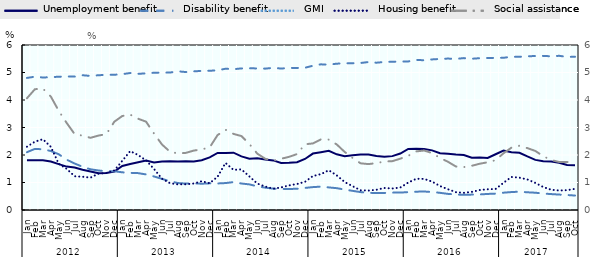
| Category | Unemployment benefit | GMI | Housing benefit | Social assistance |
|---|---|---|---|---|
| 0 | 1.812 | 2.102 | 2.301 | 4.064 |
| 1 | 1.812 | 2.222 | 2.485 | 4.393 |
| 2 | 1.81 | 2.207 | 2.573 | 4.414 |
| 3 | 1.763 | 2.146 | 2.299 | 4.127 |
| 4 | 1.67 | 2.028 | 1.679 | 3.605 |
| 5 | 1.578 | 1.829 | 1.496 | 3.164 |
| 6 | 1.548 | 1.691 | 1.226 | 2.761 |
| 7 | 1.462 | 1.571 | 1.209 | 2.703 |
| 8 | 1.403 | 1.48 | 1.178 | 2.625 |
| 9 | 1.333 | 1.437 | 1.319 | 2.706 |
| 10 | 1.346 | 1.405 | 1.347 | 2.76 |
| 11 | 1.398 | 1.408 | 1.439 | 3.212 |
| 12 | 1.6 | 1.37 | 1.789 | 3.418 |
| 13 | 1.673 | 1.35 | 2.141 | 3.468 |
| 14 | 1.736 | 1.341 | 1.999 | 3.318 |
| 15 | 1.797 | 1.293 | 1.8 | 3.211 |
| 16 | 1.726 | 1.22 | 1.49 | 2.778 |
| 17 | 1.763 | 1.132 | 1.137 | 2.381 |
| 18 | 1.771 | 1.045 | 0.976 | 2.12 |
| 19 | 1.766 | 0.98 | 0.933 | 2.054 |
| 20 | 1.77 | 0.961 | 0.936 | 2.078 |
| 21 | 1.761 | 0.971 | 0.963 | 2.161 |
| 22 | 1.81 | 0.955 | 1.047 | 2.205 |
| 23 | 1.913 | 0.969 | 0.973 | 2.276 |
| 24 | 2.075 | 0.965 | 1.211 | 2.725 |
| 25 | 2.075 | 0.979 | 1.71 | 2.917 |
| 26 | 2.084 | 1.014 | 1.46 | 2.767 |
| 27 | 1.95 | 0.963 | 1.477 | 2.689 |
| 28 | 1.864 | 0.932 | 1.221 | 2.4 |
| 29 | 1.877 | 0.861 | 0.961 | 2.048 |
| 30 | 1.838 | 0.812 | 0.851 | 1.863 |
| 31 | 1.804 | 0.776 | 0.776 | 1.792 |
| 32 | 1.707 | 0.766 | 0.821 | 1.864 |
| 33 | 1.714 | 0.767 | 0.896 | 1.933 |
| 34 | 1.737 | 0.769 | 0.945 | 2.033 |
| 35 | 1.855 | 0.803 | 1.025 | 2.39 |
| 36 | 2.052 | 0.832 | 1.236 | 2.421 |
| 37 | 2.103 | 0.85 | 1.303 | 2.567 |
| 38 | 2.154 | 0.821 | 1.445 | 2.56 |
| 39 | 2.025 | 0.794 | 1.258 | 2.384 |
| 40 | 1.955 | 0.743 | 1.019 | 2.111 |
| 41 | 1.993 | 0.696 | 0.865 | 1.892 |
| 42 | 2.021 | 0.65 | 0.717 | 1.698 |
| 43 | 2.019 | 0.624 | 0.707 | 1.669 |
| 44 | 1.96 | 0.62 | 0.737 | 1.708 |
| 45 | 1.938 | 0.62 | 0.801 | 1.761 |
| 46 | 1.959 | 0.633 | 0.782 | 1.776 |
| 47 | 2.054 | 0.634 | 0.817 | 1.866 |
| 48 | 2.222 | 0.65 | 0.997 | 1.969 |
| 49 | 2.227 | 0.666 | 1.135 | 2.131 |
| 50 | 2.214 | 0.672 | 1.131 | 2.163 |
| 51 | 2.169 | 0.656 | 1.032 | 2.07 |
| 52 | 2.064 | 0.624 | 0.873 | 1.895 |
| 53 | 2.043 | 0.586 | 0.755 | 1.754 |
| 54 | 2.018 | 0.565 | 0.648 | 1.582 |
| 55 | 2 | 0.551 | 0.625 | 1.561 |
| 56 | 1.904 | 0.56 | 0.659 | 1.607 |
| 57 | 1.909 | 0.565 | 0.727 | 1.682 |
| 58 | 1.891 | 0.584 | 0.754 | 1.735 |
| 59 | 2.027 | 0.596 | 0.764 | 1.813 |
| 60 | 2.164 | 0.63 | 0.99 | 2.063 |
| 61 | 2.102 | 0.652 | 1.201 | 2.268 |
| 62 | 2.082 | 0.666 | 1.177 | 2.337 |
| 63 | 1.947 | 0.644 | 1.11 | 2.251 |
| 64 | 1.823 | 0.628 | 0.987 | 2.147 |
| 65 | 1.775 | 0.599 | 0.834 | 1.957 |
| 66 | 1.763 | 0.579 | 0.738 | 1.818 |
| 67 | 1.719 | 0.561 | 0.709 | 1.744 |
| 68 | 1.637 | 0.546 | 0.722 | 1.741 |
| 69 | 1.627 | 0.525 | 0.77 | 1.759 |